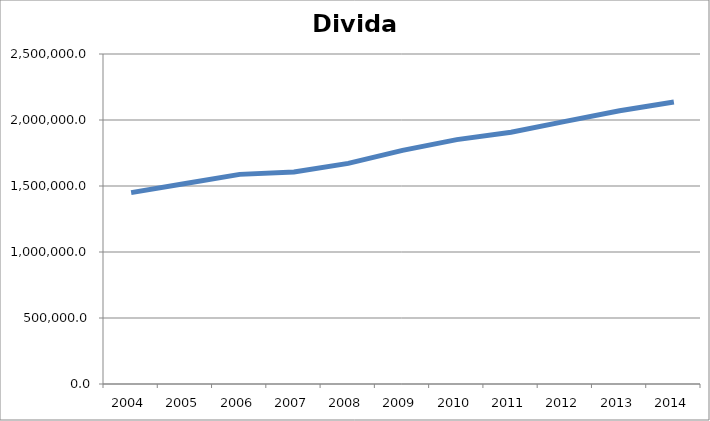
| Category | Divida pública |
|---|---|
| 2004 | 1449653.9 |
| 2005 | 1518634 |
| 2006 | 1588062.5 |
| 2007 | 1605937 |
| 2008 | 1671127.3 |
| 2009 | 1769771.1 |
| 2010 | 1851212.5 |
| 2011 | 1907478.9 |
| 2012 | 1989421.2 |
| 2013 | 2069692 |
| 2014 | 2135901.8 |